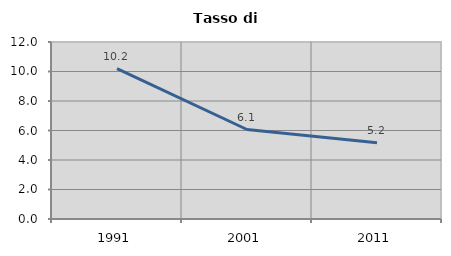
| Category | Tasso di disoccupazione   |
|---|---|
| 1991.0 | 10.196 |
| 2001.0 | 6.067 |
| 2011.0 | 5.164 |